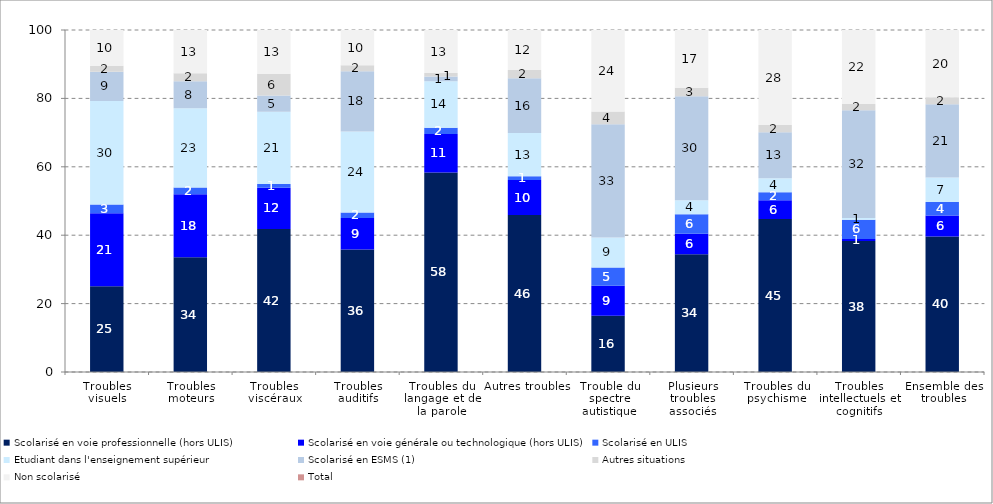
| Category | Scolarisé en voie professionnelle (hors ULIS) | Scolarisé en voie générale ou technologique (hors ULIS) | Scolarisé en ULIS | Etudiant dans l'enseignement supérieur | Scolarisé en ESMS (1) | Autres situations | Non scolarisé | Total |
|---|---|---|---|---|---|---|---|---|
| Troubles visuels | 25.092 | 21.338 | 2.519 | 30.295 | 8.525 | 1.791 | 10.44 | 100 |
| Troubles moteurs | 33.535 | 18.468 | 1.977 | 23.125 | 7.937 | 2.309 | 12.65 | 100 |
| Troubles viscéraux | 41.793 | 12.108 | 1.095 | 21.13 | 4.688 | 6.409 | 12.777 | 100 |
| Troubles auditifs | 35.789 | 9.269 | 1.603 | 23.674 | 17.612 | 1.774 | 10.279 | 100 |
| Troubles du langage et de la parole | 58.351 | 11.23 | 1.84 | 13.626 | 1.372 | 1.005 | 12.576 | 100 |
| Autres troubles | 45.876 | 10.229 | 1.097 | 12.654 | 16.03 | 2.421 | 11.694 | 100 |
| Trouble du spectre autistique | 16.415 | 8.839 | 5.304 | 8.793 | 33.114 | 3.71 | 23.826 | 100 |
| Plusieurs troubles associés | 34.42 | 5.999 | 5.688 | 4.095 | 30.419 | 2.516 | 16.863 | 100 |
| Troubles du psychisme | 44.716 | 5.521 | 2.288 | 4.095 | 13.478 | 2.116 | 27.786 | 100 |
| Troubles intellectuels et cognitifs | 38.288 | 0.619 | 5.604 | 0.536 | 31.502 | 1.813 | 21.638 | 100 |
| Ensemble des troubles | 39.586 | 6.138 | 4 | 7.122 | 21.447 | 2.04 | 19.667 | 100 |